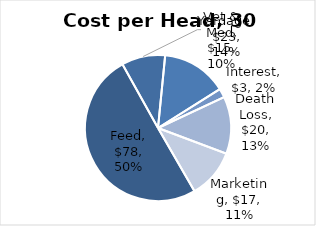
| Category | Cost per Head, 30 days |
|---|---|
| Feed | 78 |
| Vet & Med | 15 |
| Yardage | 22.5 |
| Interest | 3.067 |
| Death Loss | 19.691 |
| Marketing | 17 |